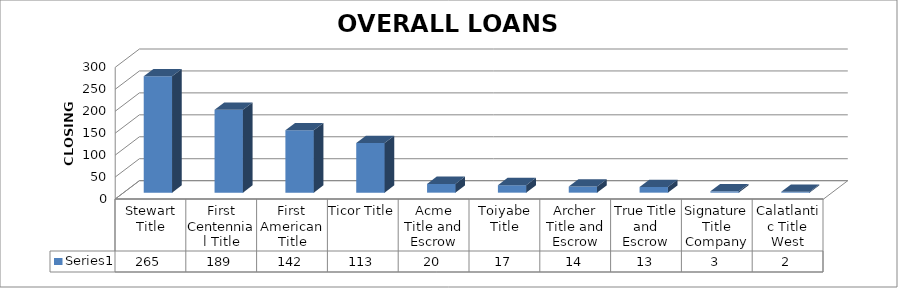
| Category | Series 0 |
|---|---|
| Stewart Title | 265 |
| First Centennial Title | 189 |
| First American Title | 142 |
| Ticor Title | 113 |
| Acme Title and Escrow | 20 |
| Toiyabe Title | 17 |
| Archer Title and Escrow | 14 |
| True Title and Escrow | 13 |
| Signature Title Company | 3 |
| Calatlantic Title West | 2 |